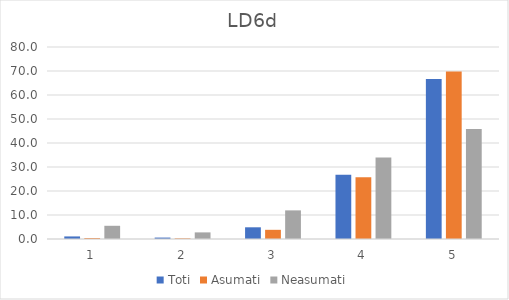
| Category | Toti | Asumati | Neasumati |
|---|---|---|---|
| 0 | 1.07 | 0.41 | 5.505 |
| 1 | 0.595 | 0.273 | 2.752 |
| 2 | 4.875 | 3.825 | 11.927 |
| 3 | 26.754 | 25.683 | 33.945 |
| 4 | 66.706 | 69.809 | 45.872 |